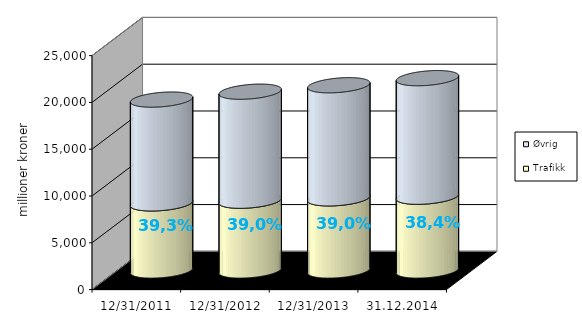
| Category | Trafikk | Øvrig |
|---|---|---|
| 31.12.2011 | 7171.76 | 11089.078 |
| 31.12.2012 | 7457.552 | 11647.433 |
| 31.12.2013 | 7709.892 | 12083.527 |
| 31.12.2014 | 7884.668 | 12665.925 |